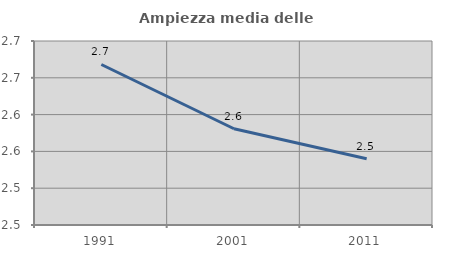
| Category | Ampiezza media delle famiglie |
|---|---|
| 1991.0 | 2.668 |
| 2001.0 | 2.581 |
| 2011.0 | 2.54 |